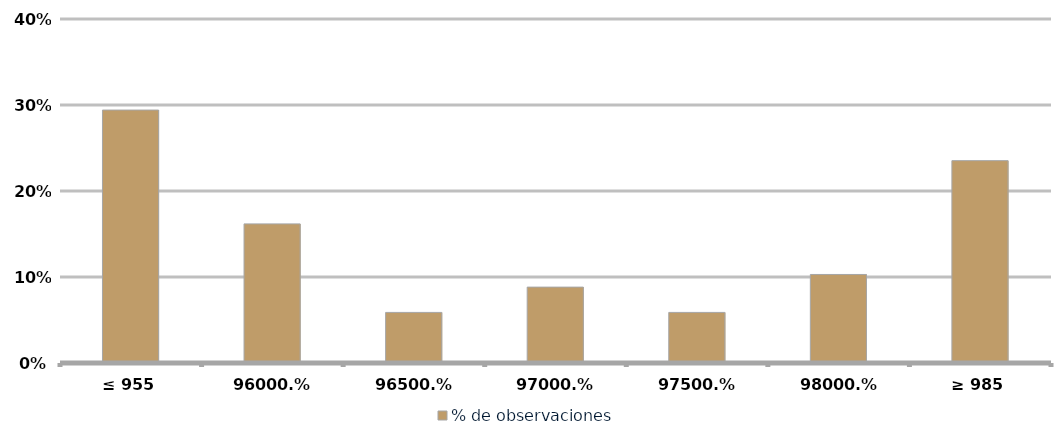
| Category | % de observaciones  |
|---|---|
| ≤ 955 | 0.294 |
| 960 | 0.162 |
| 965 | 0.059 |
| 970 | 0.088 |
| 975 | 0.059 |
| 980 | 0.103 |
| ≥ 985 | 0.235 |